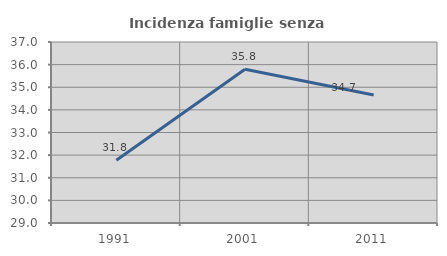
| Category | Incidenza famiglie senza nuclei |
|---|---|
| 1991.0 | 31.773 |
| 2001.0 | 35.794 |
| 2011.0 | 34.661 |